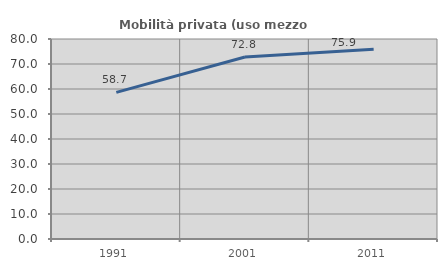
| Category | Mobilità privata (uso mezzo privato) |
|---|---|
| 1991.0 | 58.652 |
| 2001.0 | 72.779 |
| 2011.0 | 75.878 |